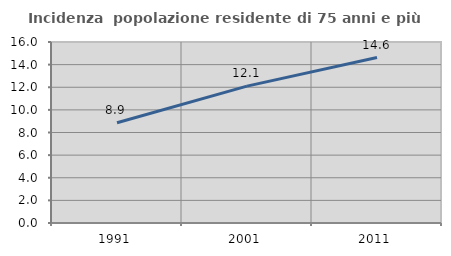
| Category | Incidenza  popolazione residente di 75 anni e più |
|---|---|
| 1991.0 | 8.864 |
| 2001.0 | 12.1 |
| 2011.0 | 14.624 |